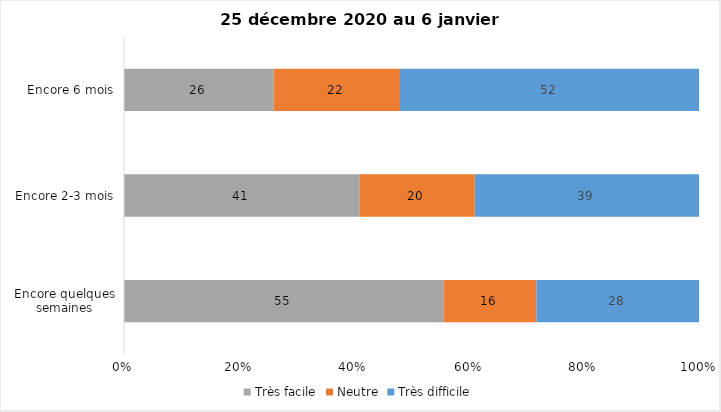
| Category | Très facile | Neutre | Très difficile |
|---|---|---|---|
| Encore quelques semaines | 55 | 16 | 28 |
| Encore 2-3 mois | 41 | 20 | 39 |
| Encore 6 mois | 26 | 22 | 52 |